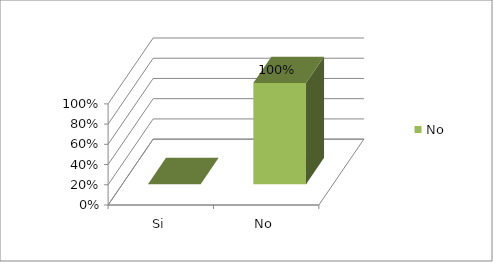
| Category | No |
|---|---|
| Si | 0 |
| No | 1 |